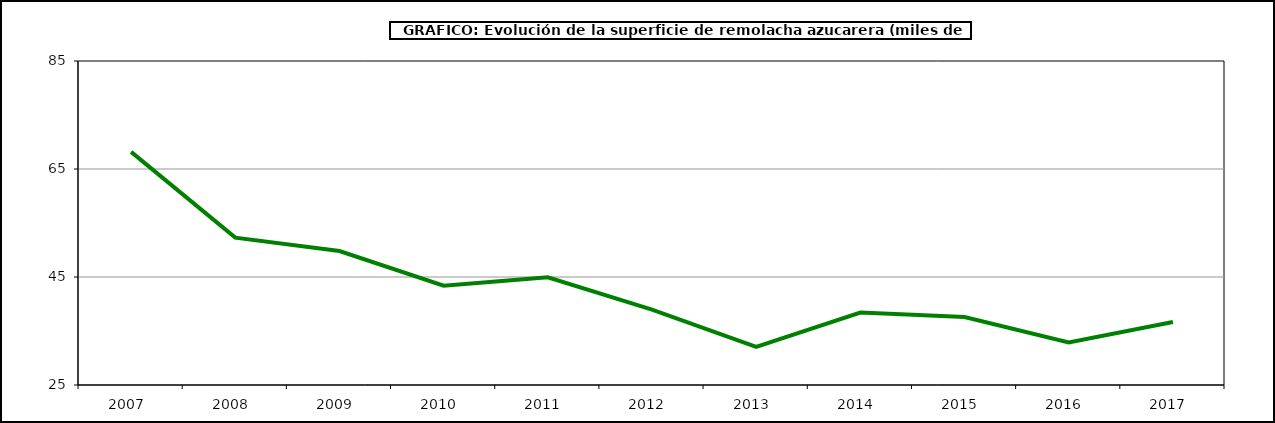
| Category | Superficie |
|---|---|
| 2007.0 | 68.171 |
| 2008.0 | 52.289 |
| 2009.0 | 49.813 |
| 2010.0 | 43.382 |
| 2011.0 | 44.931 |
| 2012.0 | 38.952 |
| 2013.0 | 32.052 |
| 2014.0 | 38.414 |
| 2015.0 | 37.605 |
| 2016.0 | 32.874 |
| 2017.0 | 36.671 |